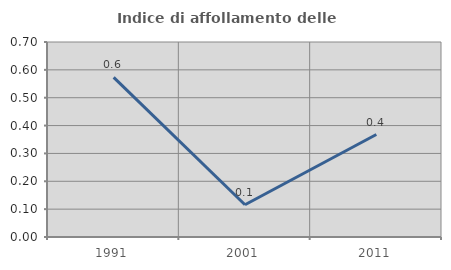
| Category | Indice di affollamento delle abitazioni  |
|---|---|
| 1991.0 | 0.573 |
| 2001.0 | 0.116 |
| 2011.0 | 0.368 |